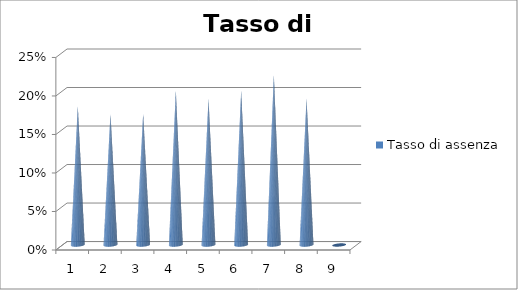
| Category | Tasso di assenza |
|---|---|
| 0 | 0.18 |
| 1 | 0.17 |
| 2 | 0.17 |
| 3 | 0.2 |
| 4 | 0.19 |
| 5 | 0.2 |
| 6 | 0.22 |
| 7 | 0.19 |
| 8 | 0 |